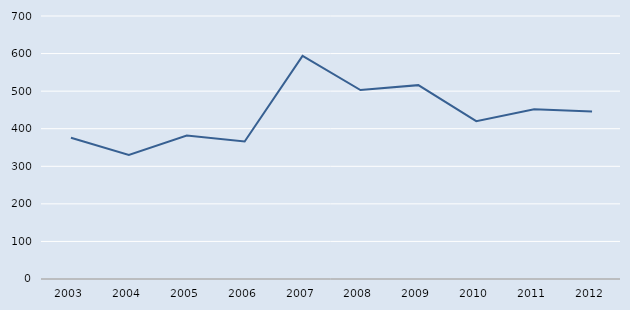
| Category | Series 0 |
|---|---|
| 2003.0 | 376 |
| 2004.0 | 330 |
| 2005.0 | 382 |
| 2006.0 | 366 |
| 2007.0 | 594 |
| 2008.0 | 503 |
| 2009.0 | 516 |
| 2010.0 | 420 |
| 2011.0 | 452 |
| 2012.0 | 446 |